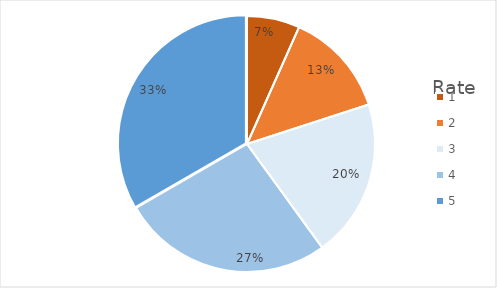
| Category | Rate | TOTAL |
|---|---|---|
| 0 | 1 | 30 |
| 1 | 2 | 60 |
| 2 | 3 | 188 |
| 3 | 4 | 361 |
| 4 | 5 | 425 |